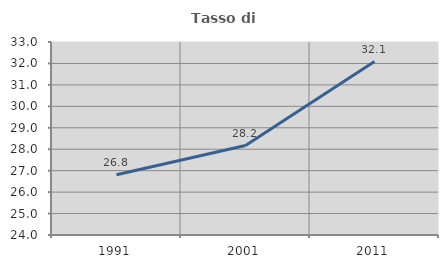
| Category | Tasso di occupazione   |
|---|---|
| 1991.0 | 26.813 |
| 2001.0 | 28.174 |
| 2011.0 | 32.09 |